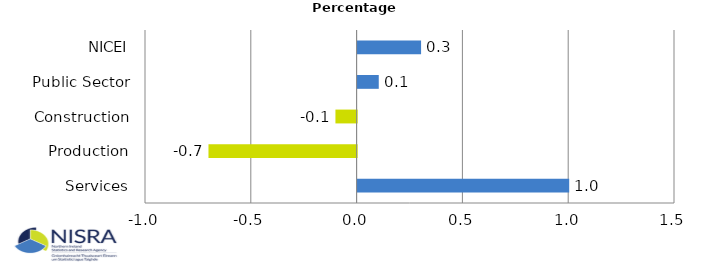
| Category | Percentage Points |
|---|---|
| Services | 1 |
| Production | -0.7 |
| Construction | -0.1 |
| Public Sector | 0.1 |
| NICEI | 0.3 |